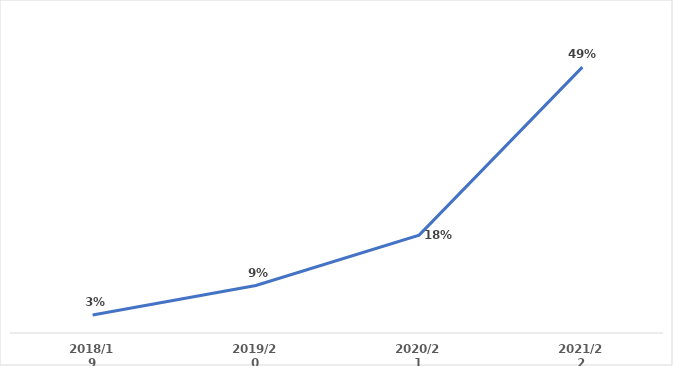
| Category | Series 0 |
|---|---|
| 2018/19 | 0.034 |
| 2019/20 | 0.088 |
| 2020/21 | 0.182 |
| 2021/22 | 0.494 |